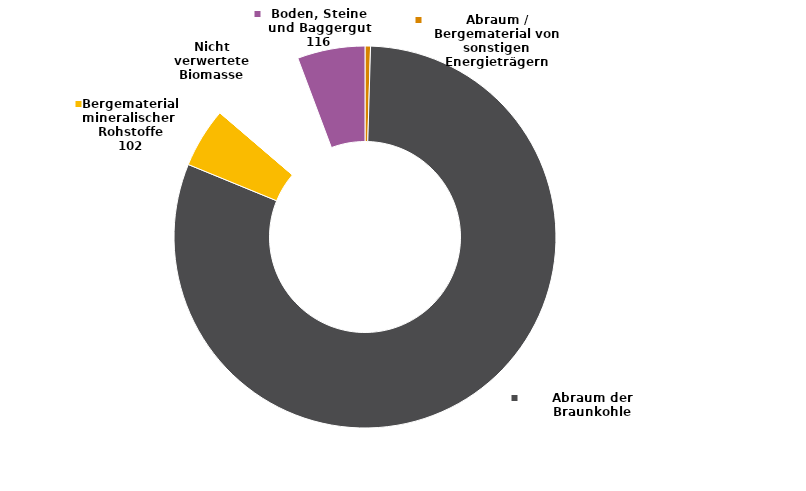
| Category | Series 4 |
|---|---|
| Abraum / Bergematerial von sonstigen Energieträgern | 9.397 |
| Abraum der Braunkohle | 1630.427 |
| Bergematerial mineralischer 
Rohstoffe | 102.349 |
| Nicht verwertete Biomasse | 161.893 |
| Boden, Steine und Baggergut | 115.509 |